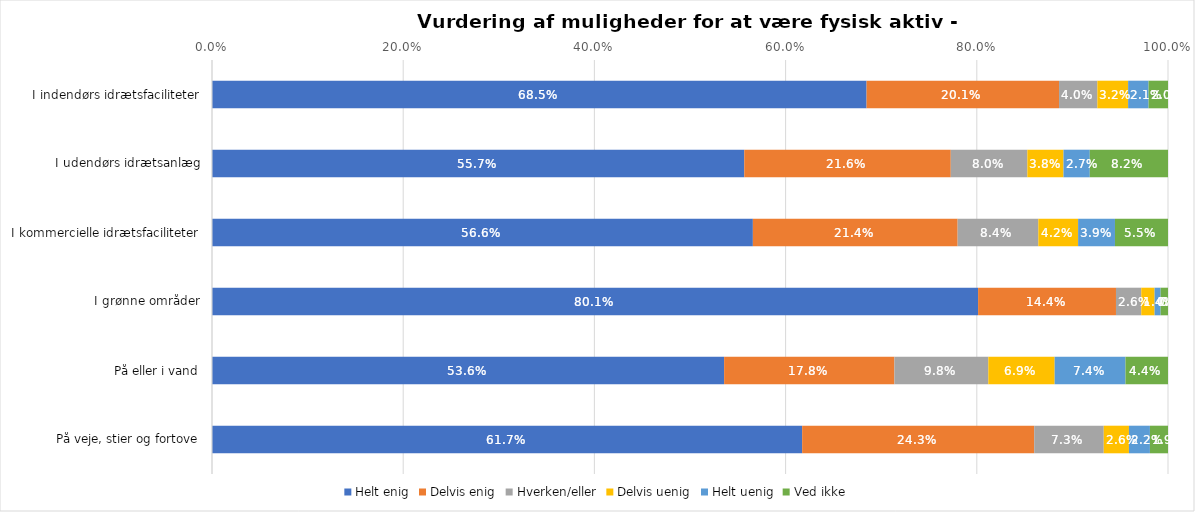
| Category | Helt enig | Delvis enig | Hverken/eller | Delvis uenig | Helt uenig | Ved ikke |
|---|---|---|---|---|---|---|
| I indendørs idrætsfaciliteter | 0.685 | 0.201 | 0.04 | 0.032 | 0.021 | 0.02 |
| I udendørs idrætsanlæg | 0.557 | 0.216 | 0.08 | 0.038 | 0.027 | 0.082 |
| I kommercielle idrætsfaciliteter | 0.566 | 0.214 | 0.084 | 0.042 | 0.039 | 0.055 |
| I grønne områder | 0.801 | 0.144 | 0.026 | 0.014 | 0.006 | 0.008 |
| På eller i vand | 0.536 | 0.178 | 0.098 | 0.069 | 0.074 | 0.044 |
| På veje, stier og fortove | 0.617 | 0.243 | 0.073 | 0.026 | 0.022 | 0.019 |